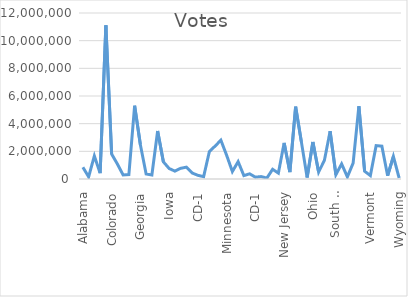
| Category | Votes |
|---|---|
| Alabama | 849624 |
| Alaska | 153778 |
| Arizona | 1672143 |
| Arkansas | 423932 |
| California | 11110250 |
| Colorado | 1804352 |
| Connecticut | 1080680 |
| Delaware | 296268 |
| District of Columbia | 317323 |
| Florida | 5297045 |
| Georgia | 2473633 |
| Hawaii | 366130 |
| Idaho | 287021 |
| Illinois | 3471915 |
| Indiana | 1242416 |
| Iowa | 759061 |
| Kansas | 570323 |
| Kentucky | 772474 |
| Louisiana | 856034 |
| Maine | 435072 |
| CD-1 | 266376 |
| CD-2 | 168696 |
| Maryland | 1985023 |
| Massachusetts | 2382202 |
| Michigan | 2804040 |
| Minnesota | 1717077 |
| Mississippi | 539398 |
| Missouri | 1253014 |
| Montana | 244786 |
| Nebraska | 374583 |
| CD-1 | 132261 |
| CD-2 | 176468 |
| CD-3 | 65854 |
| Nevada | 703486 |
| New Hampshire | 424937 |
| New Jersey | 2608335 |
| New Mexico | 501614 |
| New York | 5230985 |
| North Carolina | 2684292 |
| North Dakota | 114902 |
| Ohio | 2679165 |
| Oklahoma | 503890 |
| Oregon | 1340383 |
| Pennsylvania | 3458229 |
| Rhode Island | 307486 |
| South Carolina | 1091541 |
| South Dakota | 150471 |
| Tennessee | 1143711 |
| Texas | 5259126 |
| Utah | 560282 |
| Vermont | 242820 |
| Virginia | 2413568 |
| Washington | 2369612 |
| West Virginia | 235984 |
| Wisconsin | 1630866 |
| Wyoming | 73491 |